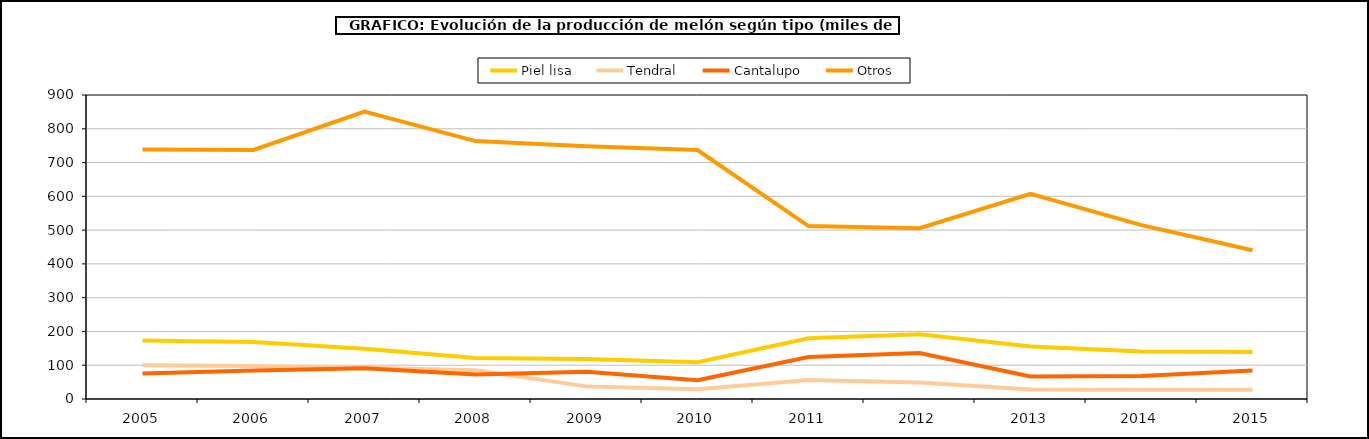
| Category | Piel lisa | Tendral | Cantalupo | Otros |
|---|---|---|---|---|
| 2005.0 | 173.147 | 99.657 | 75.181 | 738.733 |
| 2006.0 | 168.646 | 97.841 | 84.083 | 737.347 |
| 2007.0 | 149.064 | 92.263 | 90.873 | 850.954 |
| 2008.0 | 121.633 | 84.85 | 72.334 | 763.622 |
| 2009.0 | 118.315 | 37.372 | 81.013 | 748.086 |
| 2010.0 | 108.94 | 28.98 | 55.599 | 737.036 |
| 2011.0 | 179.519 | 56.591 | 124.015 | 511.871 |
| 2012.0 | 191.896 | 49.169 | 136.333 | 505.471 |
| 2013.0 | 155.121 | 28.073 | 66.453 | 607.304 |
| 2014.0 | 140.682 | 27.23 | 67.816 | 514.864 |
| 2015.0 | 139.486 | 27.748 | 84.305 | 440.517 |